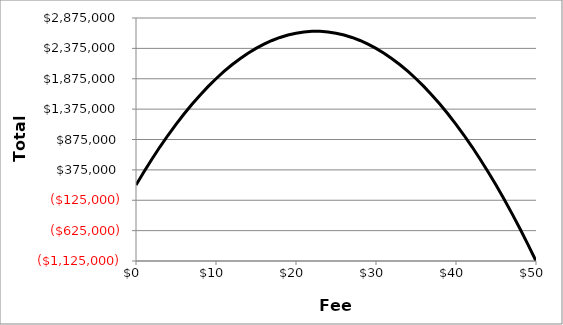
| Category | Total Surplus |
|---|---|
| 0.0 | 125000 |
| 1.0 | 345000 |
| 2.0 | 555000 |
| 3.0 | 755000 |
| 4.0 | 945000 |
| 5.0 | 1125000 |
| 6.0 | 1295000 |
| 7.0 | 1455000 |
| 8.0 | 1605000 |
| 9.0 | 1745000 |
| 10.0 | 1875000 |
| 11.0 | 1995000 |
| 12.0 | 2105000 |
| 13.0 | 2205000 |
| 14.0 | 2295000 |
| 15.0 | 2375000 |
| 16.0 | 2445000 |
| 17.0 | 2505000 |
| 18.0 | 2555000 |
| 19.0 | 2595000 |
| 20.0 | 2625000 |
| 21.0 | 2645000 |
| 22.0 | 2655000 |
| 23.0 | 2655000 |
| 24.0 | 2645000 |
| 25.0 | 2625000 |
| 26.0 | 2595000 |
| 27.0 | 2555000 |
| 28.0 | 2505000 |
| 29.0 | 2445000 |
| 30.0 | 2375000 |
| 31.0 | 2295000 |
| 32.0 | 2205000 |
| 33.0 | 2105000 |
| 34.0 | 1995000 |
| 35.0 | 1875000 |
| 36.0 | 1745000 |
| 37.0 | 1605000 |
| 38.0 | 1455000 |
| 39.0 | 1295000 |
| 40.0 | 1125000 |
| 41.0 | 945000 |
| 42.0 | 755000 |
| 43.0 | 555000 |
| 44.0 | 345000 |
| 45.0 | 125000 |
| 46.0 | -105000 |
| 47.0 | -345000 |
| 48.0 | -595000 |
| 49.0 | -855000 |
| 50.0 | -1125000 |